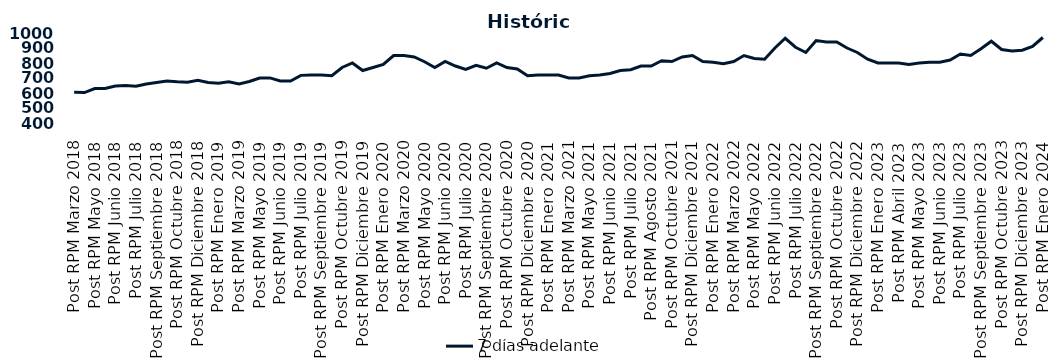
| Category | 7 días adelante  |
|---|---|
| Post RPM Marzo 2018 | 605 |
| Pre RPM Mayo 2018 | 603 |
| Post RPM Mayo 2018 | 630 |
| Pre RPM Junio 2018 | 630 |
| Post RPM Junio 2018 | 646.5 |
| Pre RPM Julio 2018 | 650 |
| Post RPM Julio 2018 | 645 |
| Pre RPM Septiembre 2018 | 660 |
| Post RPM Septiembre 2018 | 670 |
| Pre RPM Octubre 2018 | 680 |
| Post RPM Octubre 2018 | 675 |
| Pre RPM Diciembre 2018 | 672.5 |
| Post RPM Diciembre 2018 | 685 |
| Pre RPM Enero 2019 | 670 |
| Post RPM Enero 2019 | 665 |
| Pre RPM Marzo 2019 | 675 |
| Post RPM Marzo 2019 | 661 |
| Pre RPM Mayo 2019 | 677 |
| Post RPM Mayo 2019 | 700 |
| Pre RPM Junio 2019 | 700.5 |
| Post RPM Junio 2019 | 680 |
| Pre RPM Julio 2019 | 680 |
| Post RPM Julio 2019 | 717.5 |
| Pre RPM Septiembre 2019 | 720 |
| Post RPM Septiembre 2019 | 720 |
| Pre RPM Octubre 2019 | 715 |
| Post RPM Octubre 2019 | 770 |
| Pre RPM Diciembre 2019 | 800 |
| Post RPM Diciembre 2019 | 750 |
| Pre RPM Enero 2020 | 770 |
| Post RPM Enero 2020 | 790 |
| Pre RPM Marzo 2020 | 850 |
| Post RPM Marzo 2020 | 850 |
| Pre RPM Mayo 2020 | 840 |
| Post RPM Mayo 2020 | 808.5 |
| Pre RPM Junio 2020 | 770 |
| Post RPM Junio 2020 | 810 |
| Pre RPM Julio 2020 | 780 |
| Post RPM Julio 2020 | 757 |
| Pre RPM Septiembre 2020 | 785 |
| Post RPM Septiembre 2020 | 765 |
| Pre RPM Octubre 2020 | 800 |
| Post RPM Octubre 2020 | 770 |
| Pre RPM Diciembre 2020 | 760 |
| Post RPM Diciembre 2020 | 715 |
| Pre RPM Enero 2021 | 720 |
| Post RPM Enero 2021 | 720 |
| Pre RPM Marzo 2021 | 720 |
| Post RPM Marzo 2021 | 700 |
| Pre RPM Mayo 2021 | 700 |
| Post RPM Mayo 2021 | 715 |
| Pre RPM Junio 2021 | 720 |
| Post RPM Junio 2021 | 730 |
| Pre RPM Julio 2021 | 750 |
| Post RPM Julio 2021 | 755 |
| Pre RPM Agosto 2021 | 780 |
| Post RPM Agosto 2021 | 780 |
| Pre RPM Octubre 2021 | 815 |
| Post RPM Octubre 2021 | 810 |
| Pre RPM Diciembre 2021 | 840 |
| Post RPM Diciembre 2021 | 850 |
| Pre RPM Enero 2022 | 810 |
| Post RPM Enero 2022 | 805 |
| Pre RPM Marzo 2022 | 795 |
| Post RPM Marzo 2022 | 810 |
| Pre RPM Mayo 2022 | 850 |
| Post RPM Mayo 2022 | 830 |
| Pre RPM Junio 2022 | 825 |
| Post RPM Junio 2022 | 900 |
| Pre RPM Julio 2022 | 965 |
| Post RPM Julio 2022 | 905 |
| Pre RPM Septiembre 2022 | 870 |
| Post RPM Septiembre 2022 | 950 |
| Pre RPM Octubre 2022 | 940 |
| Post RPM Octubre 2022 | 940 |
| Pre RPM Diciembre 2022 | 900 |
| Post RPM Diciembre 2022 | 870 |
| Pre RPM Enero 2023 | 825 |
| Post RPM Enero 2023 | 800 |
| Pre RPM Abril 2023 | 800 |
| Post RPM Abril 2023 | 800 |
| Pre RPM Mayo 2023 | 790 |
| Post RPM Mayo 2023 | 800 |
| Pre RPM Junio 2023 | 805 |
| Post RPM Junio 2023 | 805 |
| Pre RPM Julio 2023 | 820 |
| Post RPM Julio 2023 | 860 |
| Pre RPM Septiembre 2023 | 850 |
| Post RPM Septiembre 2023 | 895 |
| Pre RPM Octubre 2023 | 945 |
| Post RPM Octubre 2023 | 890 |
| Pre RPM Diciembre 2023 | 880 |
| Post RPM Diciembre 2023 | 885 |
| Pre RPM Enero 2024 | 910 |
| Post RPM Enero 2024 | 970 |